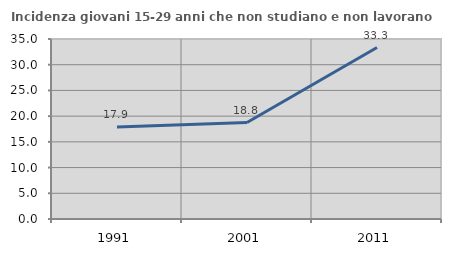
| Category | Incidenza giovani 15-29 anni che non studiano e non lavorano  |
|---|---|
| 1991.0 | 17.91 |
| 2001.0 | 18.75 |
| 2011.0 | 33.333 |